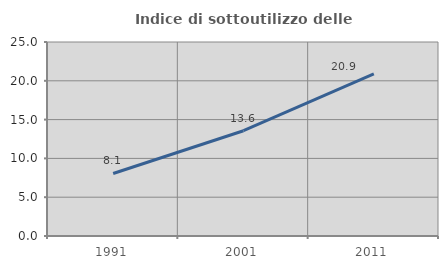
| Category | Indice di sottoutilizzo delle abitazioni  |
|---|---|
| 1991.0 | 8.058 |
| 2001.0 | 13.565 |
| 2011.0 | 20.907 |